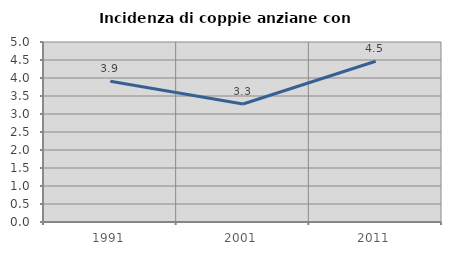
| Category | Incidenza di coppie anziane con figli |
|---|---|
| 1991.0 | 3.912 |
| 2001.0 | 3.279 |
| 2011.0 | 4.465 |